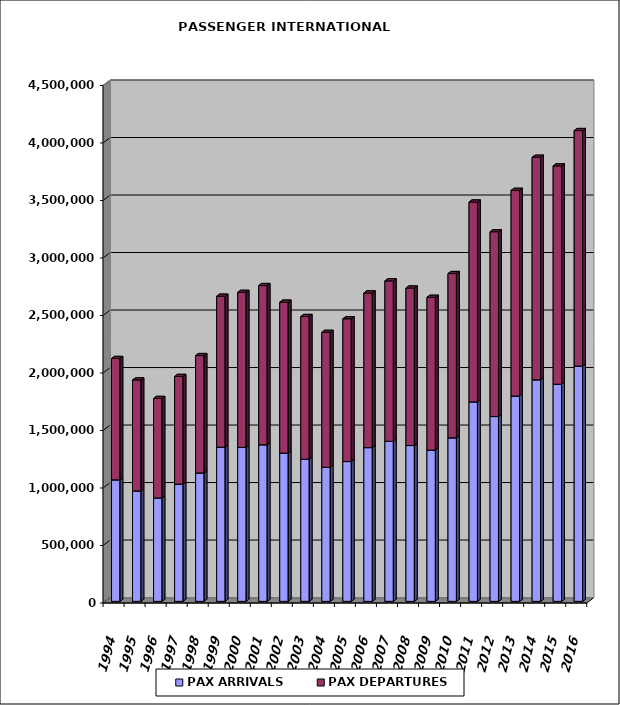
| Category | PAX ARRIVALS | PAX DEPARTURES |
|---|---|---|
| 1994.0 | 1056560 | 1055154 |
| 1995.0 | 960586 | 964336 |
| 1996.0 | 899809 | 864312 |
| 1997.0 | 1019876 | 935651 |
| 1998.0 | 1116611 | 1020417 |
| 1999.0 | 1340709 | 1312420 |
| 2000.0 | 1339139 | 1347351 |
| 2001.0 | 1361783 | 1383923 |
| 2002.0 | 1288923 | 1312723 |
| 2003.0 | 1236553 | 1240202 |
| 2004.0 | 1165843 | 1172807 |
| 2005.0 | 1215771 | 1241267 |
| 2006.0 | 1336884 | 1344673 |
| 2007.0 | 1391615 | 1395021 |
| 2008.0 | 1354921 | 1369019 |
| 2009.0 | 1315479 | 1327955 |
| 2010.0 | 1421955 | 1428051 |
| 2011.0 | 1734418 | 1737505 |
| 2012.0 | 1606843 | 1606937 |
| 2013.0 | 1785305 | 1788160 |
| 2014.0 | 1926675 | 1934341 |
| 2015.0 | 1888181 | 1897817 |
| 2016.0 | 2045555 | 2047953 |